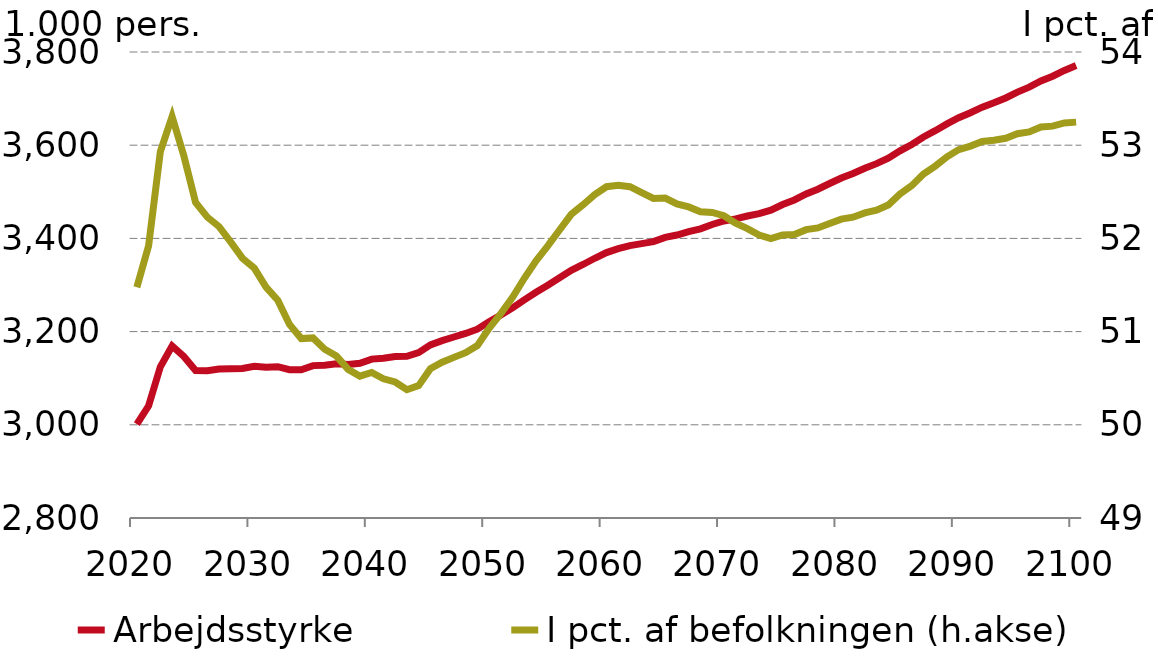
| Category |  Arbejdsstyrke |
|---|---|
| 2020.0 | 3001.56 |
| 2021.0 | 3040.7 |
| 2022.0 | 3124.353 |
| 2023.0 | 3169.237 |
| 2024.0 | 3146.529 |
| 2025.0 | 3116.418 |
| 2026.0 | 3115.913 |
| 2027.0 | 3119.778 |
| 2028.0 | 3120.482 |
| 2029.0 | 3120.981 |
| 2030.0 | 3125.361 |
| 2031.0 | 3123.375 |
| 2032.0 | 3124.703 |
| 2033.0 | 3118.32 |
| 2034.0 | 3118.012 |
| 2035.0 | 3127.006 |
| 2036.0 | 3127.719 |
| 2037.0 | 3130.907 |
| 2038.0 | 3129.454 |
| 2039.0 | 3131.892 |
| 2040.0 | 3140.939 |
| 2041.0 | 3142.919 |
| 2042.0 | 3146.685 |
| 2043.0 | 3147.051 |
| 2044.0 | 3155.007 |
| 2045.0 | 3171.416 |
| 2046.0 | 3180.515 |
| 2047.0 | 3188.424 |
| 2048.0 | 3196.075 |
| 2049.0 | 3205.216 |
| 2050.0 | 3221.231 |
| 2051.0 | 3235.454 |
| 2052.0 | 3250.828 |
| 2053.0 | 3268.14 |
| 2054.0 | 3284.555 |
| 2055.0 | 3299.523 |
| 2056.0 | 3315.405 |
| 2057.0 | 3331.578 |
| 2058.0 | 3343.994 |
| 2059.0 | 3357.354 |
| 2060.0 | 3369.582 |
| 2061.0 | 3377.901 |
| 2062.0 | 3384.652 |
| 2063.0 | 3388.737 |
| 2064.0 | 3393.176 |
| 2065.0 | 3402.22 |
| 2066.0 | 3407.283 |
| 2067.0 | 3414.473 |
| 2068.0 | 3420.639 |
| 2069.0 | 3429.823 |
| 2070.0 | 3437.386 |
| 2071.0 | 3441.974 |
| 2072.0 | 3448.076 |
| 2073.0 | 3453.287 |
| 2074.0 | 3460.528 |
| 2075.0 | 3472.681 |
| 2076.0 | 3482.479 |
| 2077.0 | 3495.271 |
| 2078.0 | 3505.589 |
| 2079.0 | 3517.77 |
| 2080.0 | 3529.505 |
| 2081.0 | 3539.305 |
| 2082.0 | 3550.562 |
| 2083.0 | 3560.435 |
| 2084.0 | 3572.113 |
| 2085.0 | 3587.786 |
| 2086.0 | 3601.509 |
| 2087.0 | 3617.702 |
| 2088.0 | 3631.164 |
| 2089.0 | 3645.763 |
| 2090.0 | 3659.035 |
| 2091.0 | 3669.776 |
| 2092.0 | 3681.557 |
| 2093.0 | 3691.122 |
| 2094.0 | 3701.387 |
| 2095.0 | 3713.859 |
| 2096.0 | 3724.534 |
| 2097.0 | 3737.785 |
| 2098.0 | 3748.111 |
| 2099.0 | 3760.361 |
| 2100.0 | 3770.944 |